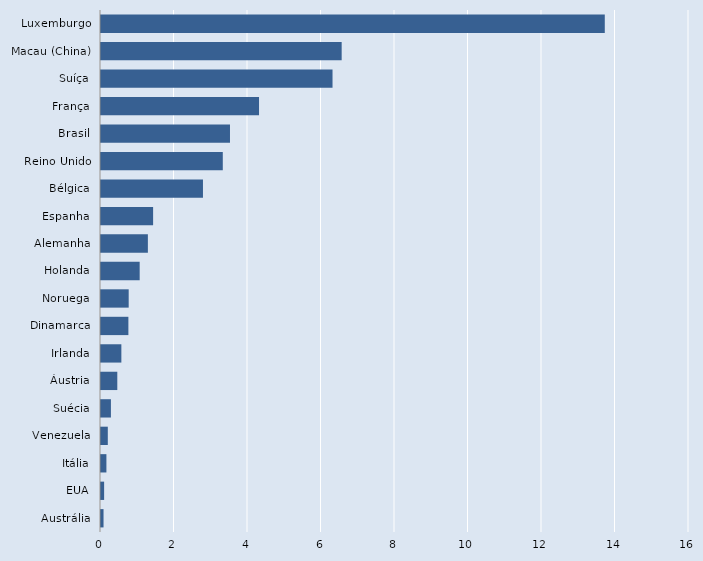
| Category | Series 0 |
|---|---|
| Austrália | 0.069 |
| EUA | 0.085 |
| Itália | 0.147 |
| Venezuela | 0.185 |
| Suécia | 0.27 |
| Áustria | 0.444 |
| Irlanda | 0.554 |
| Dinamarca | 0.745 |
| Noruega | 0.753 |
| Holanda | 1.052 |
| Alemanha | 1.276 |
| Espanha | 1.418 |
| Bélgica | 2.775 |
| Reino Unido | 3.314 |
| Brasil | 3.51 |
| França | 4.3 |
| Suíça | 6.3 |
| Macau (China) | 6.549 |
| Luxemburgo | 13.709 |